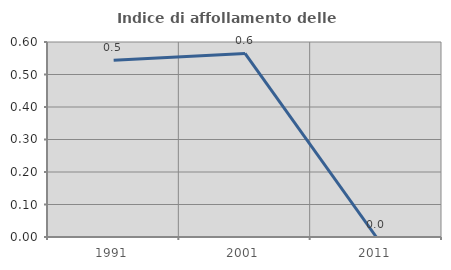
| Category | Indice di affollamento delle abitazioni  |
|---|---|
| 1991.0 | 0.543 |
| 2001.0 | 0.565 |
| 2011.0 | 0 |